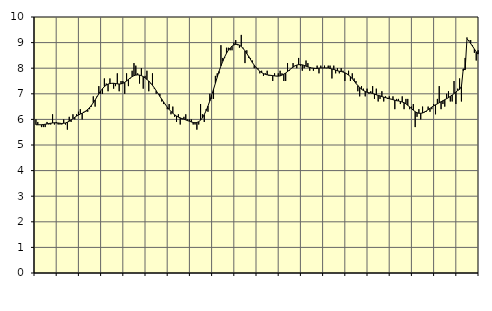
| Category | Piggar | Series 1 |
|---|---|---|
| nan | 6 | 5.79 |
| 1.0 | 5.9 | 5.79 |
| 1.0 | 5.8 | 5.79 |
| 1.0 | 5.7 | 5.79 |
| 1.0 | 5.7 | 5.8 |
| 1.0 | 5.7 | 5.81 |
| 1.0 | 5.9 | 5.82 |
| 1.0 | 5.8 | 5.84 |
| 1.0 | 5.8 | 5.85 |
| 1.0 | 6.2 | 5.86 |
| 1.0 | 5.8 | 5.87 |
| 1.0 | 5.9 | 5.86 |
| nan | 5.8 | 5.86 |
| 2.0 | 5.8 | 5.85 |
| 2.0 | 5.8 | 5.84 |
| 2.0 | 6 | 5.85 |
| 2.0 | 5.8 | 5.86 |
| 2.0 | 5.6 | 5.89 |
| 2.0 | 6.1 | 5.93 |
| 2.0 | 5.9 | 5.98 |
| 2.0 | 6.2 | 6.03 |
| 2.0 | 6 | 6.08 |
| 2.0 | 6.2 | 6.13 |
| 2.0 | 6.3 | 6.17 |
| nan | 6.4 | 6.21 |
| 3.0 | 6 | 6.24 |
| 3.0 | 6.3 | 6.28 |
| 3.0 | 6.3 | 6.33 |
| 3.0 | 6.3 | 6.39 |
| 3.0 | 6.4 | 6.46 |
| 3.0 | 6.5 | 6.55 |
| 3.0 | 6.9 | 6.65 |
| 3.0 | 6.5 | 6.76 |
| 3.0 | 6.9 | 6.88 |
| 3.0 | 7.3 | 7 |
| 3.0 | 7 | 7.11 |
| nan | 7 | 7.2 |
| 4.0 | 7.6 | 7.28 |
| 4.0 | 7.4 | 7.34 |
| 4.0 | 7.1 | 7.38 |
| 4.0 | 7.6 | 7.4 |
| 4.0 | 7.4 | 7.41 |
| 4.0 | 7.2 | 7.41 |
| 4.0 | 7.3 | 7.4 |
| 4.0 | 7.8 | 7.39 |
| 4.0 | 7.1 | 7.38 |
| 4.0 | 7.5 | 7.39 |
| 4.0 | 7.5 | 7.41 |
| nan | 7 | 7.45 |
| 5.0 | 7.8 | 7.5 |
| 5.0 | 7.3 | 7.56 |
| 5.0 | 7.6 | 7.62 |
| 5.0 | 7.9 | 7.67 |
| 5.0 | 8.2 | 7.71 |
| 5.0 | 8.1 | 7.73 |
| 5.0 | 7.8 | 7.74 |
| 5.0 | 7.4 | 7.73 |
| 5.0 | 8 | 7.71 |
| 5.0 | 7.2 | 7.67 |
| 5.0 | 7.7 | 7.62 |
| nan | 7.9 | 7.56 |
| 6.0 | 7.1 | 7.5 |
| 6.0 | 7.4 | 7.42 |
| 6.0 | 7.8 | 7.33 |
| 6.0 | 7.2 | 7.23 |
| 6.0 | 7 | 7.12 |
| 6.0 | 7 | 7.01 |
| 6.0 | 7 | 6.9 |
| 6.0 | 6.7 | 6.79 |
| 6.0 | 6.6 | 6.68 |
| 6.0 | 6.6 | 6.58 |
| 6.0 | 6.4 | 6.48 |
| nan | 6.6 | 6.39 |
| 7.0 | 6.2 | 6.31 |
| 7.0 | 6.5 | 6.24 |
| 7.0 | 6.1 | 6.18 |
| 7.0 | 5.9 | 6.13 |
| 7.0 | 6.2 | 6.09 |
| 7.0 | 5.8 | 6.06 |
| 7.0 | 6 | 6.03 |
| 7.0 | 6.1 | 6.01 |
| 7.0 | 6.2 | 5.98 |
| 7.0 | 6 | 5.95 |
| 7.0 | 6 | 5.93 |
| nan | 6 | 5.9 |
| 8.0 | 5.8 | 5.88 |
| 8.0 | 5.8 | 5.87 |
| 8.0 | 5.6 | 5.88 |
| 8.0 | 5.8 | 5.91 |
| 8.0 | 6.6 | 5.97 |
| 8.0 | 6.2 | 6.06 |
| 8.0 | 5.9 | 6.19 |
| 8.0 | 6.4 | 6.34 |
| 8.0 | 6.3 | 6.52 |
| 8.0 | 7 | 6.72 |
| 8.0 | 6.8 | 6.95 |
| nan | 6.8 | 7.18 |
| 9.0 | 7.7 | 7.41 |
| 9.0 | 7.8 | 7.65 |
| 9.0 | 7.8 | 7.88 |
| 9.0 | 8.9 | 8.09 |
| 9.0 | 8.4 | 8.27 |
| 9.0 | 8.4 | 8.44 |
| 9.0 | 8.8 | 8.58 |
| 9.0 | 8.8 | 8.7 |
| 9.0 | 8.7 | 8.79 |
| 9.0 | 8.7 | 8.86 |
| 9.0 | 9 | 8.91 |
| nan | 9.1 | 8.93 |
| 10.0 | 8.9 | 8.93 |
| 10.0 | 8.8 | 8.9 |
| 10.0 | 9.3 | 8.85 |
| 10.0 | 8.8 | 8.77 |
| 10.0 | 8.2 | 8.68 |
| 10.0 | 8.7 | 8.57 |
| 10.0 | 8.4 | 8.46 |
| 10.0 | 8.4 | 8.34 |
| 10.0 | 8.3 | 8.22 |
| 10.0 | 8 | 8.12 |
| 10.0 | 8 | 8.03 |
| nan | 8 | 7.95 |
| 11.0 | 7.8 | 7.88 |
| 11.0 | 7.9 | 7.83 |
| 11.0 | 7.7 | 7.79 |
| 11.0 | 7.8 | 7.76 |
| 11.0 | 7.9 | 7.74 |
| 11.0 | 7.7 | 7.73 |
| 11.0 | 7.7 | 7.72 |
| 11.0 | 7.5 | 7.71 |
| 11.0 | 7.8 | 7.7 |
| 11.0 | 7.7 | 7.69 |
| 11.0 | 7.8 | 7.69 |
| nan | 7.9 | 7.7 |
| 12.0 | 7.8 | 7.73 |
| 12.0 | 7.5 | 7.77 |
| 12.0 | 7.5 | 7.81 |
| 12.0 | 8.2 | 7.87 |
| 12.0 | 7.9 | 7.93 |
| 12.0 | 8 | 7.99 |
| 12.0 | 8.2 | 8.04 |
| 12.0 | 8.1 | 8.09 |
| 12.0 | 8 | 8.12 |
| 12.0 | 8.4 | 8.14 |
| 12.0 | 8.1 | 8.14 |
| nan | 7.9 | 8.13 |
| 13.0 | 8 | 8.11 |
| 13.0 | 8.3 | 8.08 |
| 13.0 | 8.2 | 8.05 |
| 13.0 | 7.9 | 8.03 |
| 13.0 | 8 | 8.01 |
| 13.0 | 7.9 | 8 |
| 13.0 | 8 | 7.99 |
| 13.0 | 8.1 | 7.99 |
| 13.0 | 7.8 | 8 |
| 13.0 | 8.1 | 8.01 |
| 13.0 | 8 | 8.01 |
| nan | 8.1 | 8.01 |
| 14.0 | 8 | 8.01 |
| 14.0 | 8.1 | 8.01 |
| 14.0 | 8.1 | 7.99 |
| 14.0 | 7.6 | 7.97 |
| 14.0 | 8.1 | 7.95 |
| 14.0 | 7.8 | 7.93 |
| 14.0 | 8 | 7.9 |
| 14.0 | 7.8 | 7.88 |
| 14.0 | 8 | 7.87 |
| 14.0 | 7.9 | 7.85 |
| 14.0 | 7.5 | 7.82 |
| nan | 7.8 | 7.78 |
| 15.0 | 7.9 | 7.73 |
| 15.0 | 7.5 | 7.67 |
| 15.0 | 7.8 | 7.59 |
| 15.0 | 7.6 | 7.5 |
| 15.0 | 7.5 | 7.41 |
| 15.0 | 7.1 | 7.32 |
| 15.0 | 6.9 | 7.25 |
| 15.0 | 7.3 | 7.18 |
| 15.0 | 7.2 | 7.13 |
| 15.0 | 6.9 | 7.09 |
| 15.0 | 7.2 | 7.06 |
| nan | 7 | 7.04 |
| 16.0 | 7.1 | 7.03 |
| 16.0 | 7.3 | 7.01 |
| 16.0 | 6.8 | 6.99 |
| 16.0 | 7.2 | 6.96 |
| 16.0 | 6.7 | 6.94 |
| 16.0 | 6.8 | 6.92 |
| 16.0 | 7.1 | 6.89 |
| 16.0 | 6.7 | 6.87 |
| 16.0 | 6.9 | 6.85 |
| 16.0 | 6.8 | 6.83 |
| 16.0 | 6.9 | 6.81 |
| nan | 6.8 | 6.79 |
| 17.0 | 6.9 | 6.77 |
| 17.0 | 6.4 | 6.75 |
| 17.0 | 6.8 | 6.73 |
| 17.0 | 6.8 | 6.72 |
| 17.0 | 6.6 | 6.7 |
| 17.0 | 6.9 | 6.68 |
| 17.0 | 6.4 | 6.65 |
| 17.0 | 6.8 | 6.61 |
| 17.0 | 6.8 | 6.55 |
| 17.0 | 6.4 | 6.49 |
| 17.0 | 6.5 | 6.42 |
| nan | 6.6 | 6.36 |
| 18.0 | 5.7 | 6.3 |
| 18.0 | 6.1 | 6.26 |
| 18.0 | 6.4 | 6.24 |
| 18.0 | 6 | 6.24 |
| 18.0 | 6.5 | 6.25 |
| 18.0 | 6.3 | 6.28 |
| 18.0 | 6.3 | 6.33 |
| 18.0 | 6.5 | 6.38 |
| 18.0 | 6.3 | 6.43 |
| 18.0 | 6.4 | 6.48 |
| 18.0 | 6.6 | 6.53 |
| nan | 6.2 | 6.57 |
| 19.0 | 6.8 | 6.61 |
| 19.0 | 7.3 | 6.65 |
| 19.0 | 6.4 | 6.69 |
| 19.0 | 6.6 | 6.73 |
| 19.0 | 6.5 | 6.77 |
| 19.0 | 7 | 6.81 |
| 19.0 | 7.1 | 6.85 |
| 19.0 | 6.7 | 6.9 |
| 19.0 | 6.7 | 6.95 |
| 19.0 | 7.5 | 7.01 |
| 19.0 | 6.6 | 7.07 |
| nan | 7.2 | 7.13 |
| 20.0 | 7.6 | 7.17 |
| 20.0 | 6.7 | 7.29 |
| 20.0 | 7.9 | 7.97 |
| 20.0 | 8.4 | 7.94 |
| 20.0 | 9.2 | 9.15 |
| 20.0 | 9.1 | 9.06 |
| 20.0 | 9.1 | 8.96 |
| 20.0 | 8.9 | 8.86 |
| 20.0 | 8.6 | 8.75 |
| 20.0 | 8.3 | 8.64 |
| 20.0 | 8.7 | 8.55 |